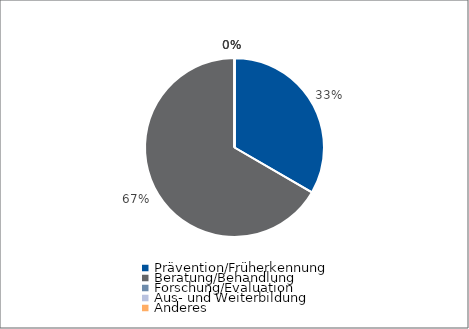
| Category | Series 0 |
|---|---|
| Prävention/Früherkennung | 30098.8 |
| Beratung/Behandlung | 60100 |
| Forschung/Evaluation | 0 |
| Aus- und Weiterbildung | 0 |
| Anderes | 0 |